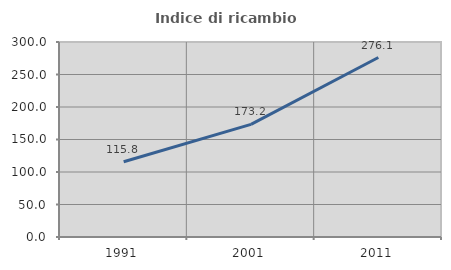
| Category | Indice di ricambio occupazionale  |
|---|---|
| 1991.0 | 115.762 |
| 2001.0 | 173.196 |
| 2011.0 | 276.144 |